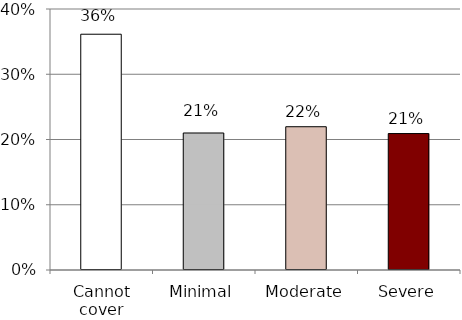
| Category | Percent covering LTSS w/ buffer |
|---|---|
| Cannot cover | 0.361 |
| Minimal | 0.21 |
| Moderate | 0.22 |
| Severe | 0.209 |